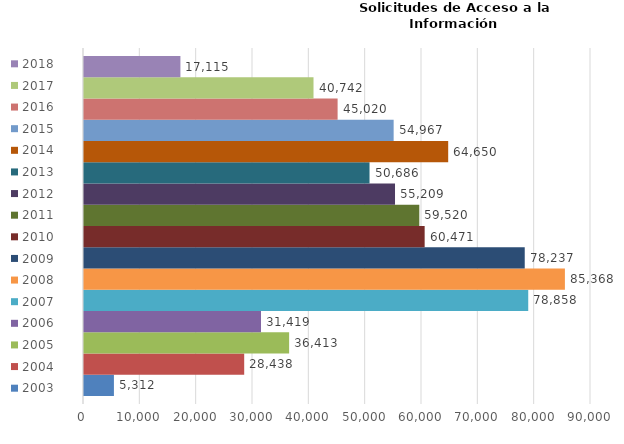
| Category | 2003 | 2004 | 2005 | 2006 | 2007 | 2008 | 2009 | 2010 | 2011 | 2012 | 2013 | 2014 | 2015 | 2016 | 2017 | 2018 |
|---|---|---|---|---|---|---|---|---|---|---|---|---|---|---|---|---|
| 0 | 5312 | 28438 | 36413 | 31419 | 78858 | 85368 | 78237 | 60471 | 59520 | 55209 | 50686 | 64650 | 54967 | 45020 | 40742 | 17115 |